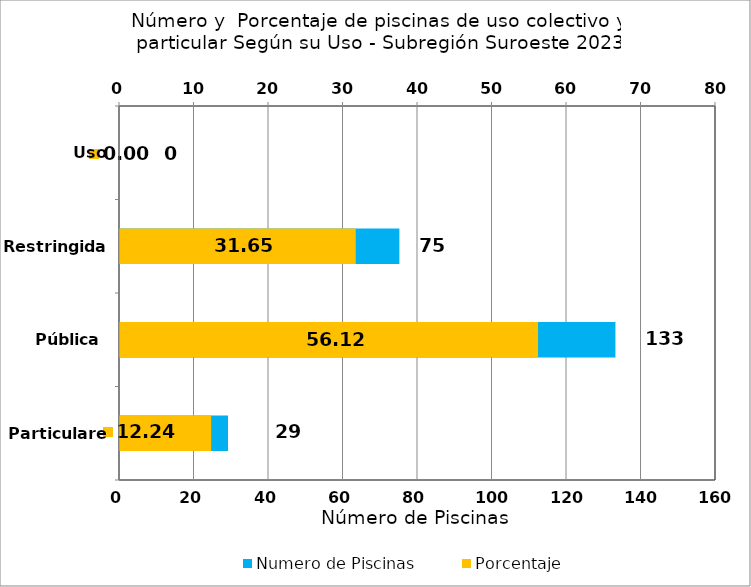
| Category | Numero de Piscinas |
|---|---|
| Particulares | 29 |
| Pública | 133 |
| Restringida | 75 |
| Uso Especial | 0 |